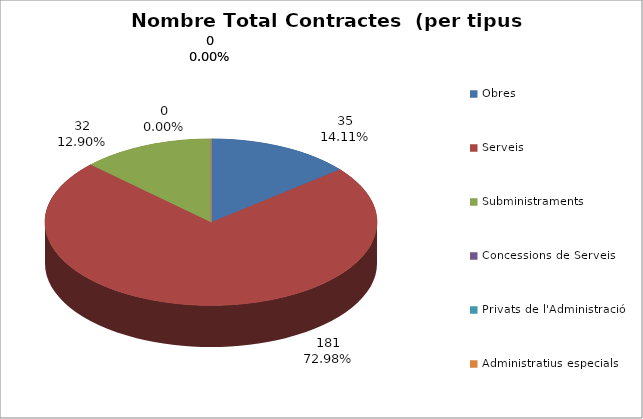
| Category | Nombre Total Contractes |
|---|---|
| Obres | 35 |
| Serveis | 181 |
| Subministraments | 32 |
| Concessions de Serveis | 0 |
| Privats de l'Administració | 0 |
| Administratius especials | 0 |